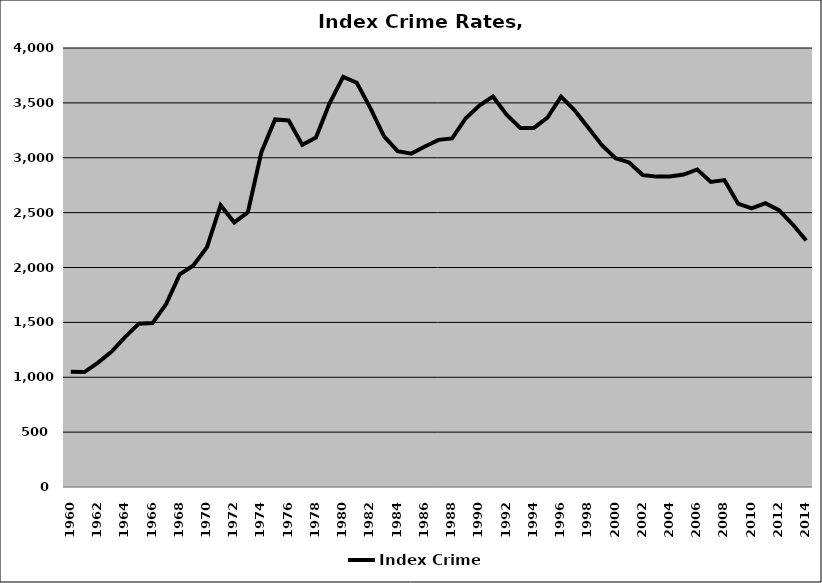
| Category | Index Crime |
|---|---|
| 1960.0 | 1049.432 |
| 1961.0 | 1047.419 |
| 1962.0 | 1134.168 |
| 1963.0 | 1233.255 |
| 1964.0 | 1368.165 |
| 1965.0 | 1488.142 |
| 1966.0 | 1493.214 |
| 1967.0 | 1666.48 |
| 1968.0 | 1936.996 |
| 1969.0 | 2017.818 |
| 1970.0 | 2185.832 |
| 1971.0 | 2568.145 |
| 1972.0 | 2410.783 |
| 1973.0 | 2501.748 |
| 1974.0 | 3053.528 |
| 1975.0 | 3349.446 |
| 1976.0 | 3339.943 |
| 1977.0 | 3117.497 |
| 1978.0 | 3184.723 |
| 1979.0 | 3495.414 |
| 1980.0 | 3736.339 |
| 1981.0 | 3683.21 |
| 1982.0 | 3452.76 |
| 1983.0 | 3195.485 |
| 1984.0 | 3059.524 |
| 1985.0 | 3037.442 |
| 1986.0 | 3101.842 |
| 1987.0 | 3163.229 |
| 1988.0 | 3176.353 |
| 1989.0 | 3360.415 |
| 1990.0 | 3476.102 |
| 1991.0 | 3558.549 |
| 1992.0 | 3392.714 |
| 1993.0 | 3271.381 |
| 1994.0 | 3271.872 |
| 1995.0 | 3364.886 |
| 1996.0 | 3556.37 |
| 1997.0 | 3431.473 |
| 1998.0 | 3272.961 |
| 1999.0 | 3113.653 |
| 2000.0 | 2995.329 |
| 2001.0 | 2957.302 |
| 2002.0 | 2842.493 |
| 2003.0 | 2828.031 |
| 2004.0 | 2828.753 |
| 2005.0 | 2847.199 |
| 2006.0 | 2892.975 |
| 2007.0 | 2779.89 |
| 2008.0 | 2795.979 |
| 2009.0 | 2581.325 |
| 2010.0 | 2539.186 |
| 2011.0 | 2586.569 |
| 2012.0 | 2522.203 |
| 2013.0 | 2394.131 |
| 2014.0 | 2245.838 |